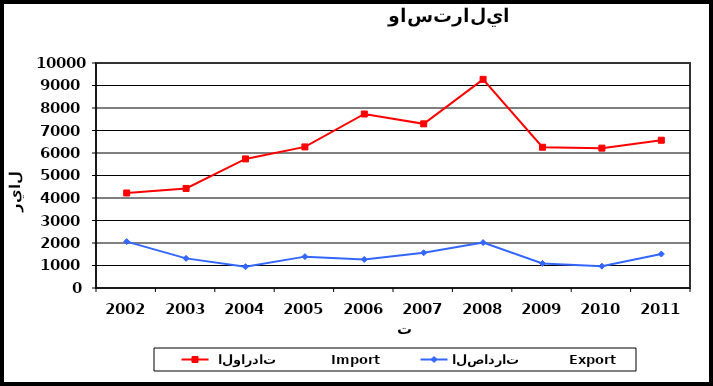
| Category |  الواردات           Import | الصادرات          Export |
|---|---|---|
| 2002.0 | 4223 | 2062 |
| 2003.0 | 4425 | 1317 |
| 2004.0 | 5737 | 946 |
| 2005.0 | 6270 | 1394 |
| 2006.0 | 7734 | 1269 |
| 2007.0 | 7296 | 1565 |
| 2008.0 | 9274 | 2018 |
| 2009.0 | 6256 | 1091 |
| 2010.0 | 6216 | 970 |
| 2011.0 | 6567 | 1510 |